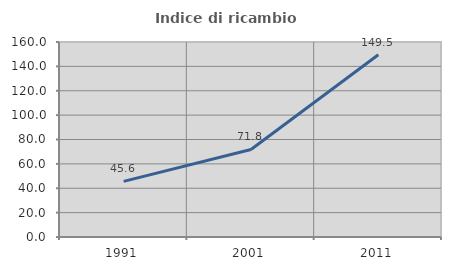
| Category | Indice di ricambio occupazionale  |
|---|---|
| 1991.0 | 45.627 |
| 2001.0 | 71.802 |
| 2011.0 | 149.545 |